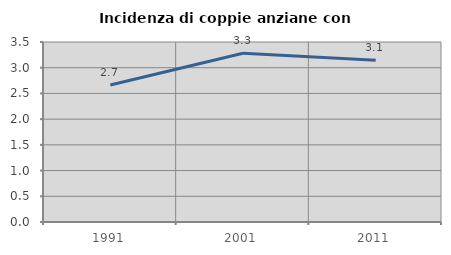
| Category | Incidenza di coppie anziane con figli |
|---|---|
| 1991.0 | 2.665 |
| 2001.0 | 3.281 |
| 2011.0 | 3.145 |